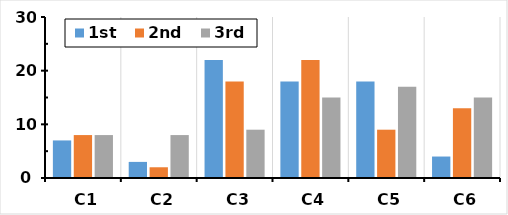
| Category | 1st | 2nd | 3rd |
|---|---|---|---|
| C1 | 7 | 8 | 8 |
| C2 | 3 | 2 | 8 |
| C3 | 22 | 18 | 9 |
| C4 | 18 | 22 | 15 |
| C5 | 18 | 9 | 17 |
| C6 | 4 | 13 | 15 |